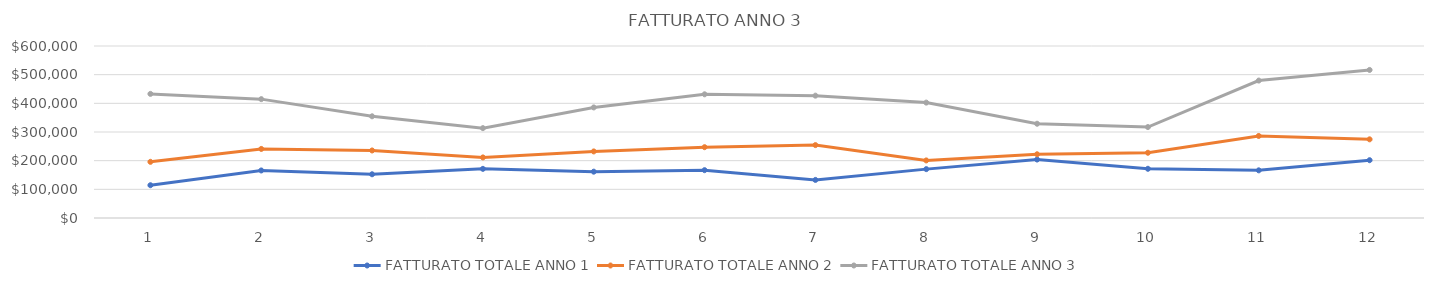
| Category | FATTURATO TOTALE ANNO 1 | FATTURATO TOTALE ANNO 2 | FATTURATO TOTALE ANNO 3 |
|---|---|---|---|
| 0 | 114350 | 195956 | 432976 |
| 1 | 165800 | 240945 | 414652 |
| 2 | 152557 | 235555 | 354787 |
| 3 | 171421 | 211305 | 313504 |
| 4 | 161618 | 232213 | 385676 |
| 5 | 166870 | 247021 | 431520 |
| 6 | 132884 | 254266 | 426803 |
| 7 | 170481 | 200836 | 402533 |
| 8 | 203968 | 222280 | 328813 |
| 9 | 171681 | 227616 | 317269 |
| 10 | 166247 | 286221 | 479413 |
| 11 | 201651 | 274416 | 516463 |